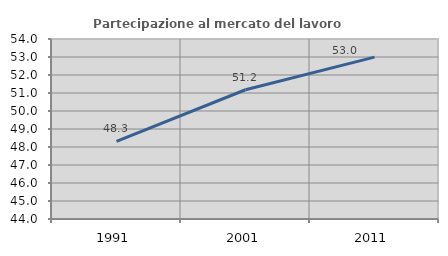
| Category | Partecipazione al mercato del lavoro  femminile |
|---|---|
| 1991.0 | 48.312 |
| 2001.0 | 51.18 |
| 2011.0 | 52.993 |